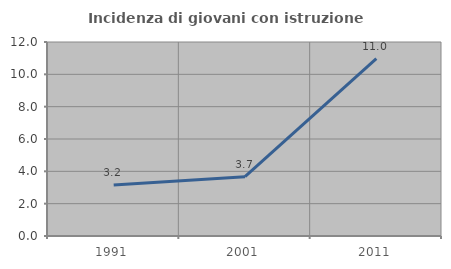
| Category | Incidenza di giovani con istruzione universitaria |
|---|---|
| 1991.0 | 3.16 |
| 2001.0 | 3.669 |
| 2011.0 | 10.978 |